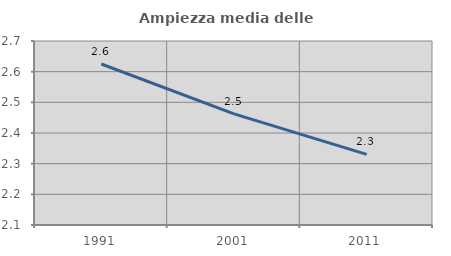
| Category | Ampiezza media delle famiglie |
|---|---|
| 1991.0 | 2.625 |
| 2001.0 | 2.462 |
| 2011.0 | 2.33 |